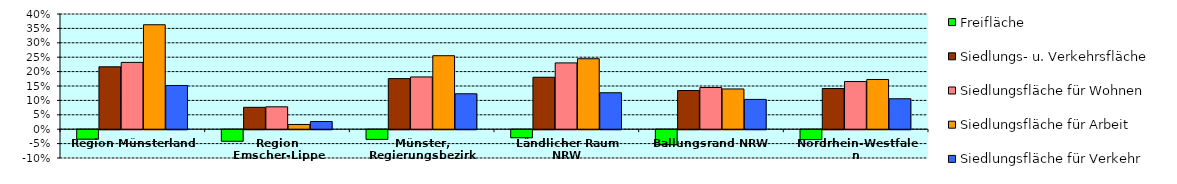
| Category | Freifläche | Siedlungs- u. Verkehrsfläche | Siedlungsfläche für Wohnen | Siedlungsfläche für Arbeit | Siedlungsfläche für Verkehr |
|---|---|---|---|---|---|
| Region Münsterland | -0.033 | 0.217 | 0.232 | 0.363 | 0.152 |
| Region Emscher-Lippe | -0.04 | 0.076 | 0.078 | 0.016 | 0.027 |
| Münster, Regierungsbezirk | -0.034 | 0.176 | 0.181 | 0.255 | 0.123 |
| Ländlicher Raum NRW | -0.028 | 0.18 | 0.23 | 0.245 | 0.127 |
| Ballungsrand NRW | -0.052 | 0.134 | 0.145 | 0.14 | 0.103 |
| Nordrhein-Westfalen | -0.034 | 0.141 | 0.165 | 0.173 | 0.106 |